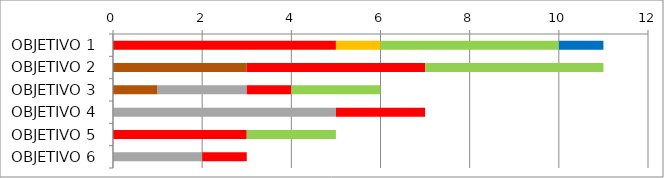
| Category | Series 0 | Series 1 | Series 2 | Series 3 | Series 4 | Series 5 |
|---|---|---|---|---|---|---|
| OBJETIVO 1 | 0 | 0 | 5 | 1 | 4 | 1 |
| OBJETIVO 2 | 3 | 0 | 4 | 0 | 4 | 0 |
| OBJETIVO 3 | 1 | 2 | 1 | 0 | 2 | 0 |
| OBJETIVO 4 | 0 | 5 | 2 | 0 | 0 | 0 |
| OBJETIVO 5 | 0 | 0 | 3 | 0 | 2 | 0 |
| OBJETIVO 6 | 0 | 2 | 1 | 0 | 0 | 0 |